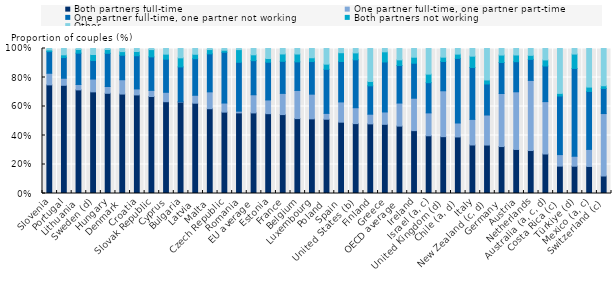
| Category | Both partners full-time | One partner full-time, one partner part-time | One partner full-time, one partner not working | Both partners not working | Other |
|---|---|---|---|---|---|
| Slovenia | 74.898 | 8.022 | 14.943 | 1.152 | 0.984 |
| Portugal | 74.617 | 4.882 | 14.26 | 1.882 | 4.359 |
| Lithuania | 71.46 | 3.732 | 21.588 | 2.576 | 0.644 |
| Sweden (d) | 70.098 | 8.818 | 12.786 | 4.173 | 4.126 |
| Hungary | 69.107 | 4.679 | 22.899 | 2.639 | 0.676 |
| Denmark | 68.581 | 9.883 | 16.871 | 2.525 | 2.14 |
| Croatia | 67.98 | 4.143 | 22.881 | 2.939 | 2.057 |
| Slovak Republic | 66.91 | 4.232 | 23.085 | 5.03 | 0.743 |
| Cyprus | 63.304 | 6.497 | 22.821 | 3.479 | 3.899 |
| Bulgaria | 63.071 | 0.199 | 24.035 | 6.262 | 6.433 |
| Latvia | 62.282 | 5.464 | 25.208 | 3.073 | 3.974 |
| Malta | 58.48 | 11.622 | 26.2 | 2.968 | 0.73 |
| Czech Republic | 56.119 | 6.278 | 35.018 | 1.387 | 1.197 |
| Romania | 55.59 | 1.192 | 33.698 | 8.759 | 0.761 |
| EU average | 55.573 | 12.521 | 23.535 | 4.029 | 4.342 |
| Estonia | 55.056 | 9.465 | 26.01 | 2.582 | 6.888 |
| France | 54.424 | 14.614 | 22.12 | 5.081 | 3.761 |
| Belgium | 51.664 | 19.411 | 19.71 | 5.413 | 3.801 |
| Luxembourg | 51.482 | 17.032 | 22.486 | 2.623 | 6.377 |
| Poland | 51.225 | 4.025 | 30.395 | 3.573 | 10.782 |
| Spain | 49.194 | 13.966 | 27.854 | 6.078 | 2.908 |
| United States (b) | 48.197 | 10.957 | 33.067 | 4.762 | 3.017 |
| Finland | 48.013 | 6.671 | 19.58 | 3.012 | 22.725 |
| Greece | 47.712 | 8.52 | 34.474 | 7.007 | 2.286 |
| OECD average | 46.48 | 15.903 | 25.893 | 3.894 | 7.829 |
| Ireland | 43.363 | 22.362 | 24.111 | 4.147 | 6.017 |
| Israel (a, c) | 39.816 | 15.786 | 20.83 | 5.892 | 17.677 |
| United Kingdom (d) | 39.202 | 31.648 | 20.171 | 2.997 | 5.982 |
| Chile (a, d) | 39.004 | 9.623 | 44.541 | 2.957 | 3.875 |
| Italy | 33.46 | 17.644 | 35.781 | 7.837 | 5.278 |
| New Zealand (c, d) | 33.411 | 20.723 | 21.383 | 2.798 | 21.686 |
| Germany | 32.382 | 36.583 | 21.36 | 5.154 | 4.521 |
| Austria | 30.376 | 39.768 | 20.751 | 4.632 | 4.472 |
| Netherlands | 29.633 | 48.357 | 14.509 | 2.803 | 4.699 |
| Australia (a, c, d) | 27.25 | 36.113 | 24.576 | 4.198 | 7.863 |
| Costa Rica (c) | 18.88 | 7.945 | 40.407 | 1.823 | 30.945 |
| Türkiye (d) | 18.83 | 6.864 | 60.54 | 9.929 | 3.836 |
| Mexico (a, c) | 18.661 | 11.761 | 39.946 | 3.018 | 26.613 |
| Switzerland (c) | 12.066 | 43.063 | 17.32 | 1.869 | 25.682 |